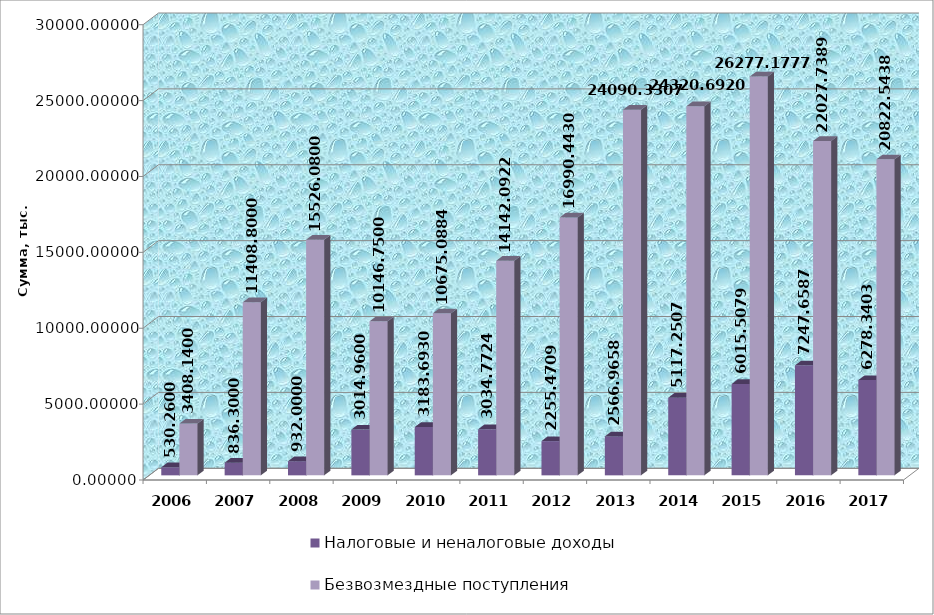
| Category | Налоговые и неналоговые доходы | Безвозмездные поступления |
|---|---|---|
| 2006.0 | 530.26 | 3408.14 |
| 2007.0 | 836.3 | 11408.8 |
| 2008.0 | 932 | 15526.08 |
| 2009.0 | 3014.96 | 10146.75 |
| 2010.0 | 3183.693 | 10675.088 |
| 2011.0 | 3034.772 | 14142.092 |
| 2012.0 | 2255.471 | 16990.443 |
| 2013.0 | 2566.966 | 24090.331 |
| 2014.0 | 5117.251 | 24320.692 |
| 2015.0 | 6015.508 | 26277.178 |
| 2016.0 | 7247.659 | 22027.739 |
| 2017.0 | 6278.34 | 20822.544 |